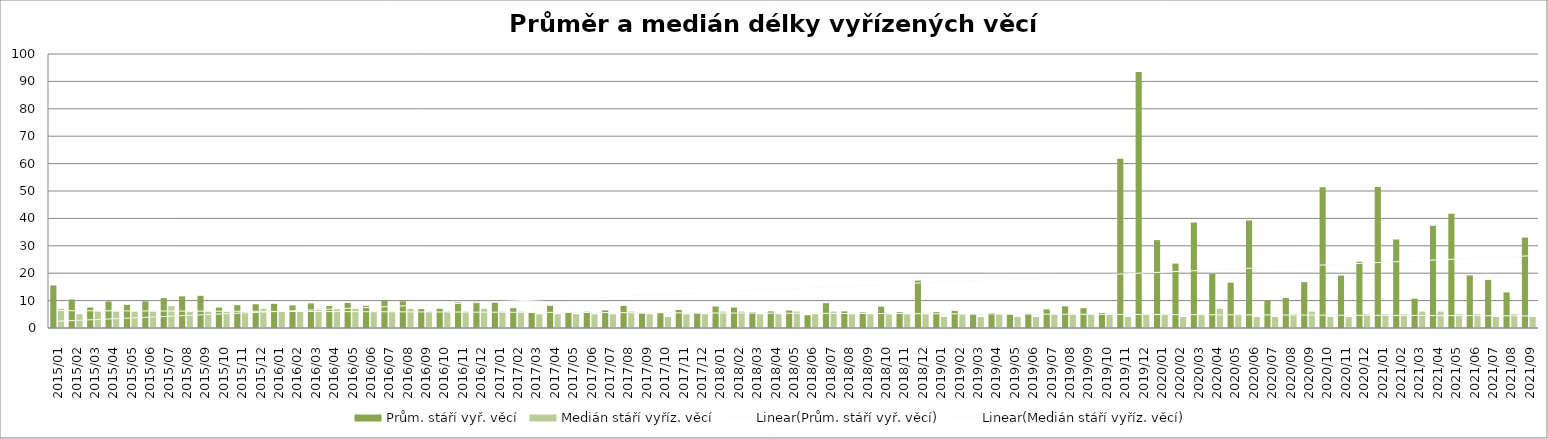
| Category | Prům. stáří vyř. věcí | Medián stáří vyříz. věcí |
|---|---|---|
| 2015/01 | 15.52 | 7 |
| 2015/02 | 10.38 | 5 |
| 2015/03 | 7.46 | 6 |
| 2015/04 | 9.67 | 6 |
| 2015/05 | 8.44 | 6 |
| 2015/06 | 9.71 | 6 |
| 2015/07 | 10.93 | 8 |
| 2015/08 | 11.55 | 6 |
| 2015/09 | 11.75 | 6 |
| 2015/10 | 7.46 | 6 |
| 2015/11 | 8.32 | 6 |
| 2015/12 | 8.68 | 7 |
| 2016/01 | 8.83 | 6 |
| 2016/02 | 8.26 | 6 |
| 2016/03 | 8.98 | 7 |
| 2016/04 | 8.04 | 7 |
| 2016/05 | 9.12 | 7 |
| 2016/06 | 8.09 | 6 |
| 2016/07 | 10.11 | 6 |
| 2016/08 | 9.76 | 7 |
| 2016/09 | 6.89 | 6 |
| 2016/10 | 7.02 | 6 |
| 2016/11 | 9.35 | 6 |
| 2016/12 | 9.55 | 7 |
| 2017/01 | 9.25 | 6 |
| 2017/02 | 7.23 | 6 |
| 2017/03 | 5.46 | 5 |
| 2017/04 | 8.09 | 5 |
| 2017/05 | 5.8 | 5 |
| 2017/06 | 5.92 | 5 |
| 2017/07 | 6.44 | 5 |
| 2017/08 | 8.07 | 6 |
| 2017/09 | 5.26 | 5 |
| 2017/10 | 5.49 | 4 |
| 2017/11 | 6.58 | 5 |
| 2017/12 | 5.31 | 5 |
| 2018/01 | 7.85 | 6 |
| 2018/02 | 7.44 | 6 |
| 2018/03 | 5.7 | 5 |
| 2018/04 | 6.07 | 5 |
| 2018/05 | 6.39 | 6 |
| 2018/06 | 4.66 | 5 |
| 2018/07 | 9.06 | 6 |
| 2018/08 | 6.07 | 5 |
| 2018/09 | 5.69 | 5 |
| 2018/10 | 7.79 | 5 |
| 2018/11 | 5.76 | 5 |
| 2018/12 | 17.31 | 5 |
| 2019/01 | 5.8 | 4 |
| 2019/02 | 6.26 | 5 |
| 2019/03 | 4.95 | 4 |
| 2019/04 | 5.46 | 5 |
| 2019/05 | 4.88 | 4 |
| 2019/06 | 5.19 | 4 |
| 2019/07 | 6.79 | 5 |
| 2019/08 | 7.9 | 5 |
| 2019/09 | 7.23 | 5 |
| 2019/10 | 5.47 | 5 |
| 2019/11 | 61.8 | 4 |
| 2019/12 | 93.46 | 5 |
| 2020/01 | 32.05 | 5 |
| 2020/02 | 23.52 | 4 |
| 2020/03 | 38.5 | 5 |
| 2020/04 | 19.74 | 7 |
| 2020/05 | 16.53 | 5 |
| 2020/06 | 39.25 | 4 |
| 2020/07 | 10.04 | 4 |
| 2020/08 | 10.94 | 5 |
| 2020/09 | 16.73 | 6 |
| 2020/10 | 51.36 | 4 |
| 2020/11 | 19.11 | 4 |
| 2020/12 | 24.17 | 5 |
| 2021/01 | 51.46 | 5 |
| 2021/02 | 32.3 | 5 |
| 2021/03 | 10.72 | 6 |
| 2021/04 | 37.28 | 6 |
| 2021/05 | 41.72 | 5 |
| 2021/06 | 19.2 | 5 |
| 2021/07 | 17.55 | 4 |
| 2021/08 | 12.99 | 5 |
| 2021/09 | 33.01 | 4 |